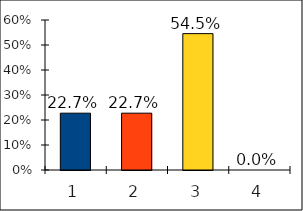
| Category | Series 0 |
|---|---|
| 0 | 0.227 |
| 1 | 0.227 |
| 2 | 0.545 |
| 3 | 0 |